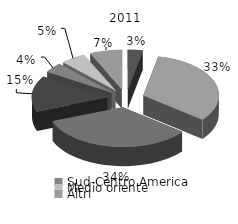
| Category | 2001 |
|---|---|
| Africa | 3.144 |
| Asia | 32.535 |
| UE 27 | 33.505 |
| NAFTA | 14.64 |
| Sud-Centro America | 4.03 |
| Medio oriente | 5.273 |
| Altri | 6.872 |